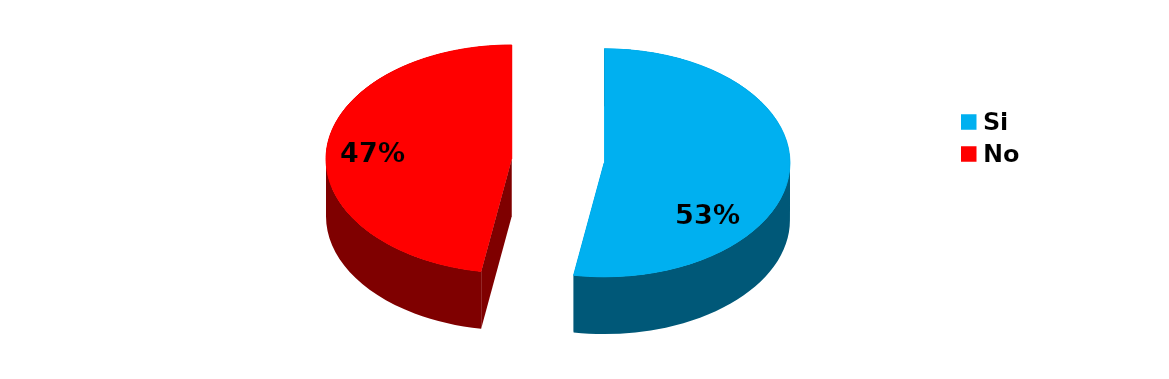
| Category | Series 0 |
|---|---|
| Si | 10 |
| No | 9 |